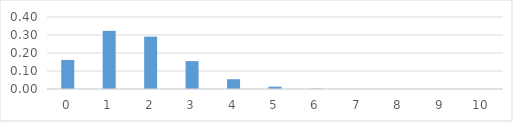
| Category | Series 0 |
|---|---|
| 0.0 | 0.162 |
| 1.0 | 0.323 |
| 2.0 | 0.291 |
| 3.0 | 0.155 |
| 4.0 | 0.054 |
| 5.0 | 0.013 |
| 6.0 | 0.002 |
| 7.0 | 0 |
| 8.0 | 0 |
| 9.0 | 0 |
| 10.0 | 0 |